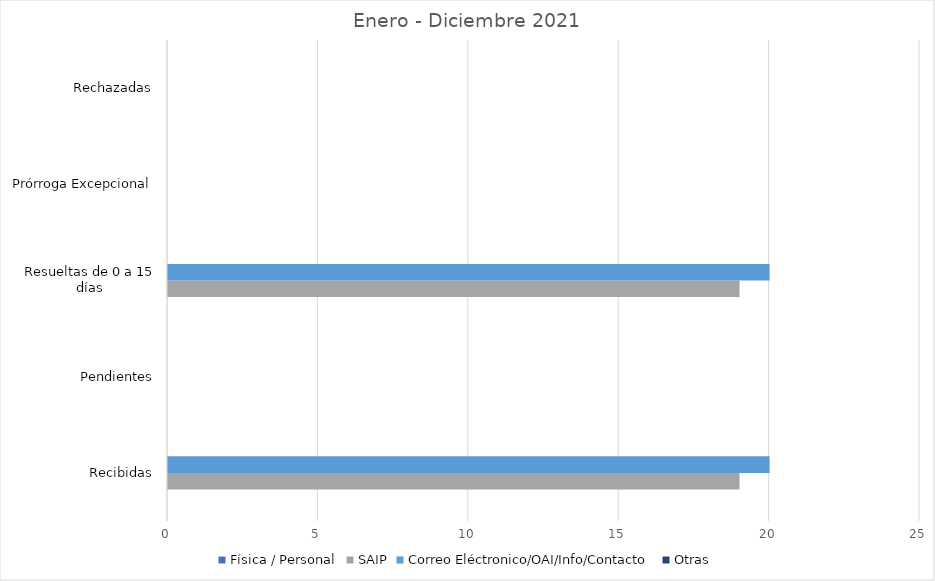
| Category | Física / Personal | SAIP | Correo Eléctronico/OAI/Info/Contacto | Otras |
|---|---|---|---|---|
| Recibidas | 0 | 19 | 20 | 0 |
| Pendientes | 0 | 0 | 0 | 0 |
| Resueltas de 0 a 15 días | 0 | 19 | 20 | 0 |
| Prórroga Excepcional | 0 | 0 | 0 | 0 |
| Rechazadas | 0 | 0 | 0 | 0 |